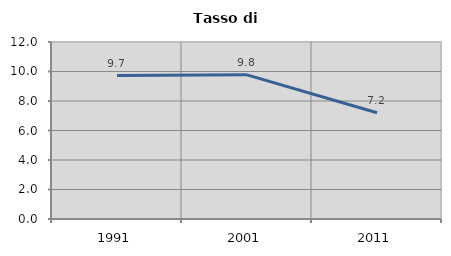
| Category | Tasso di disoccupazione   |
|---|---|
| 1991.0 | 9.722 |
| 2001.0 | 9.774 |
| 2011.0 | 7.207 |